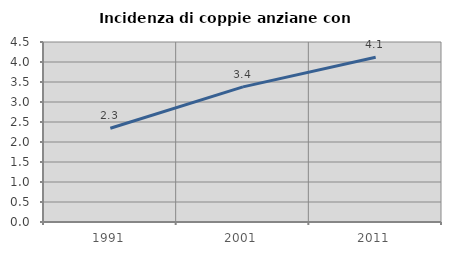
| Category | Incidenza di coppie anziane con figli |
|---|---|
| 1991.0 | 2.343 |
| 2001.0 | 3.378 |
| 2011.0 | 4.117 |